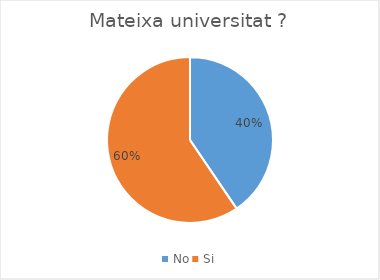
| Category | Series 0 |
|---|---|
| No | 49 |
| Si | 72 |